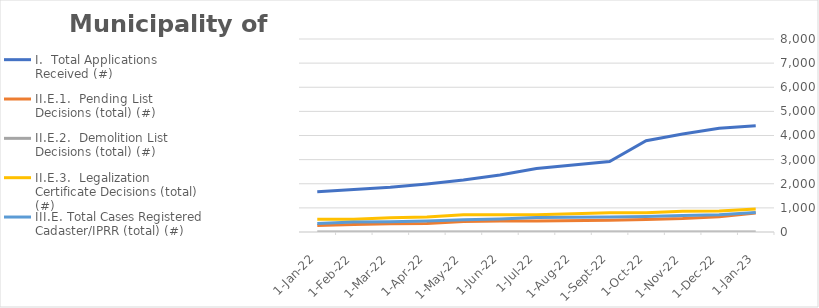
| Category | I.  Total Applications Received (#)  | II.E.1.  Pending List Decisions (total) (#)  | II.E.2.  Demolition List Decisions (total) (#) | II.E.3.  Legalization Certificate Decisions (total) (#)  | III.E. Total Cases Registered Cadaster/IPRR (total) (#) |
|---|---|---|---|---|---|
| 2022-01-31 | 1666 | 274 | 0 | 531 | 354 |
| 2022-02-28 | 1757 | 316 | 0 | 531 | 414 |
| 2022-03-28 | 1852 | 347 | 0 | 591 | 428 |
| 2022-04-29 | 1989 | 353 | 0 | 624 | 455 |
| 2022-05-30 | 2156 | 433 | 0 | 714 | 507 |
| 2022-06-27 | 2366 | 456 | 0 | 715 | 538 |
| 2022-07-29 | 2634 | 456 | 0 | 715 | 601 |
| 2022-09-05 | 2923 | 485 | 0 | 793 | 624 |
| 2022-10-28 | 3784 | 522 | 0 | 793 | 638 |
| 2022-11-28 | 4060 | 558 | 0 | 858 | 682 |
| 2022-12-23 | 4297 | 635 | 0 | 873 | 720 |
| 2023-01-27 | 4405 | 787 | 0 | 951 | 809 |